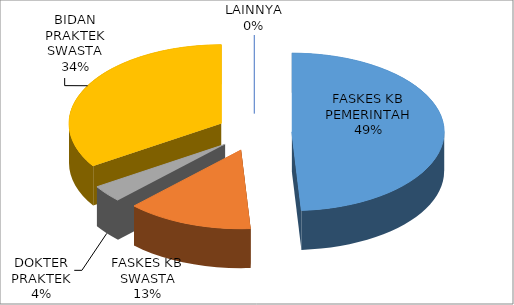
| Category | Series 0 |
|---|---|
| FASKES KB PEMERINTAH | 49 |
| FASKES KB SWASTA | 13.41 |
| DOKTER PRAKTEK | 3.5 |
| BIDAN PRAKTEK SWASTA | 34.09 |
| LAINNYA | 0 |